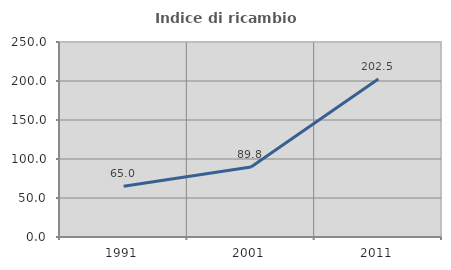
| Category | Indice di ricambio occupazionale  |
|---|---|
| 1991.0 | 65.017 |
| 2001.0 | 89.837 |
| 2011.0 | 202.545 |